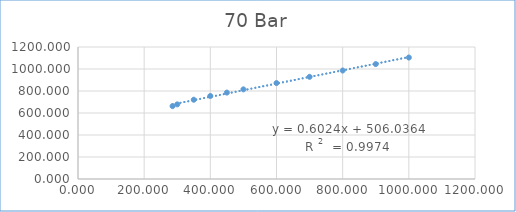
| Category | Series 0 |
|---|---|
| 285.8 | 662.351 |
| 300.0 | 678.428 |
| 350.0 | 720.712 |
| 400.0 | 754.706 |
| 450.0 | 785.547 |
| 500.0 | 814.955 |
| 600.0 | 872.097 |
| 700.0 | 928.858 |
| 800.0 | 986.24 |
| 900.0 | 1044.673 |
| 1000.0 | 1104.276 |